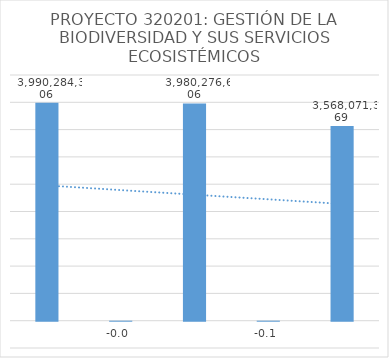
| Category | Series 0 |
|---|---|
| 0 | 3990284306 |
| 1 | -0.003 |
| 2 | 3980276606.04 |
| 3 | -0.104 |
| 4 | 3568071369.466 |